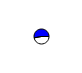
| Category | Series 0 |
|---|---|
| 0 | 2097406 |
| 1 | 2354264 |